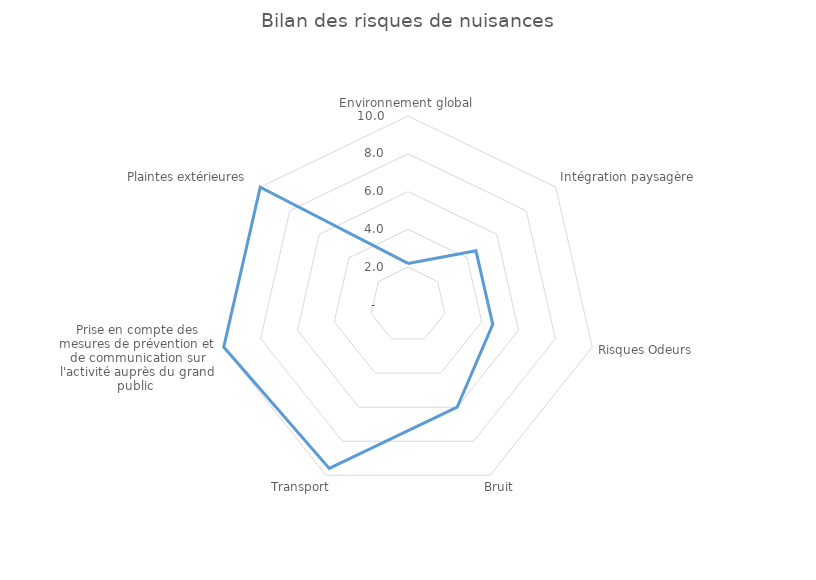
| Category | Series 0 |
|---|---|
| Environnement global | 2.2 |
| Intégration paysagère | 4.6 |
| Risques Odeurs | 4.6 |
| Bruit  | 6 |
| Transport  | 9.6 |
| Prise en compte des mesures de prévention et de communication sur l'activité auprès du grand public  | 10 |
| Plaintes extérieures  | 10 |